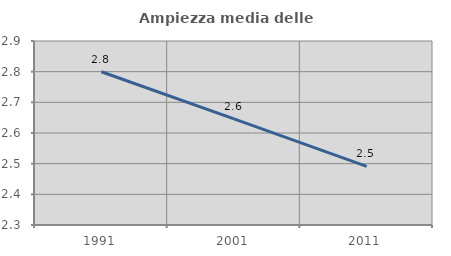
| Category | Ampiezza media delle famiglie |
|---|---|
| 1991.0 | 2.8 |
| 2001.0 | 2.646 |
| 2011.0 | 2.491 |